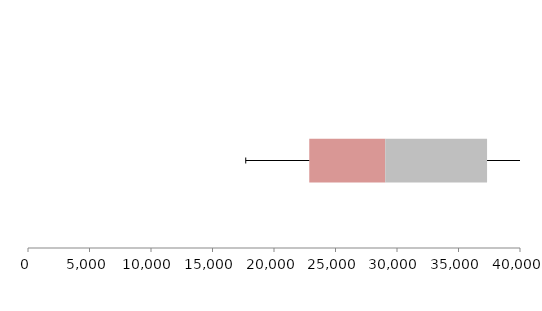
| Category | Series 1 | Series 2 | Series 3 |
|---|---|---|---|
| 0 | 22866.822 | 6177.582 | 8276.971 |